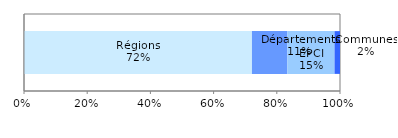
| Category | Régions | Départements | EPCI | Communes |
|---|---|---|---|---|
| 0 | 0.721 | 0.112 | 0.149 | 0.017 |